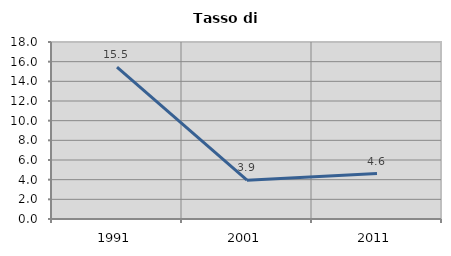
| Category | Tasso di disoccupazione   |
|---|---|
| 1991.0 | 15.455 |
| 2001.0 | 3.947 |
| 2011.0 | 4.615 |